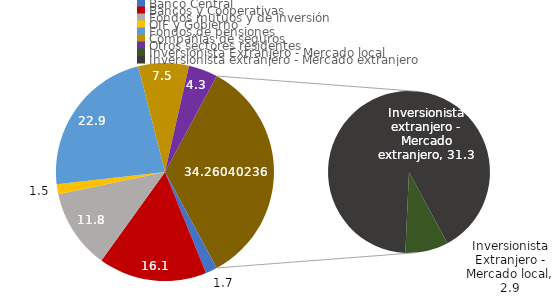
| Category | Series 0 |
|---|---|
| Banco Central | 1.724 |
| Bancos y Cooperativas | 16.057 |
| Fondos mutuos y de inversión | 11.805 |
| OIF y Gobierno | 1.475 |
| Fondos de pensiones | 22.858 |
| Compañias de seguros | 7.49 |
| Otros sectores residentes | 4.331 |
| Inversionista Extranjero - Mercado local | 2.941 |
| Inversionista extranjero - Mercado extranjero | 31.319 |